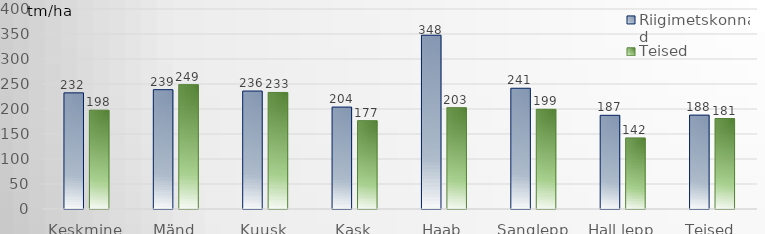
| Category | Riigimetskonnad | Teised valdajad |
|---|---|---|
| Keskmine | 232.268 | 197.667 |
| Mänd | 238.676 | 248.712 |
| Kuusk | 235.912 | 233.096 |
| Kask | 203.858 | 176.682 |
| Haab | 347.546 | 202.68 |
| Sanglepp | 241.479 | 199.418 |
| Hall lepp | 187.398 | 142.16 |
| Teised | 187.8 | 180.955 |